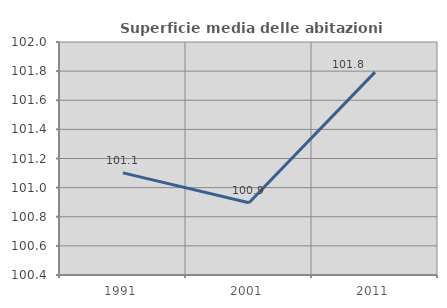
| Category | Superficie media delle abitazioni occupate |
|---|---|
| 1991.0 | 101.101 |
| 2001.0 | 100.896 |
| 2011.0 | 101.793 |